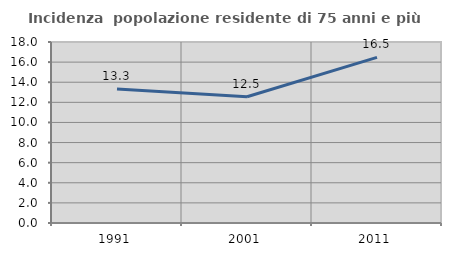
| Category | Incidenza  popolazione residente di 75 anni e più |
|---|---|
| 1991.0 | 13.327 |
| 2001.0 | 12.549 |
| 2011.0 | 16.474 |